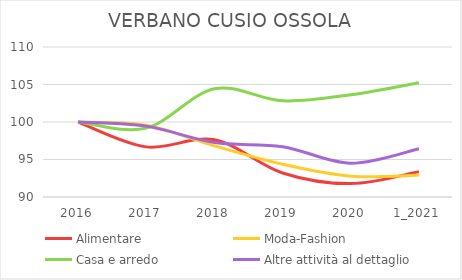
| Category | Alimentare | Moda-Fashion | Casa e arredo | Altre attività al dettaglio |
|---|---|---|---|---|
| 2016 | 100 | 100 | 100 | 100 |
| 2017 | 96.682 | 99.566 | 99.194 | 99.451 |
| 2018 | 97.63 | 96.821 | 104.435 | 97.255 |
| 2019 | 93.207 | 94.364 | 102.823 | 96.706 |
| 2020 | 91.785 | 92.775 | 103.629 | 94.511 |
| 1_2021 | 93.365 | 92.919 | 105.242 | 96.432 |